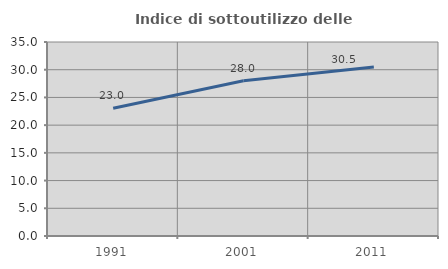
| Category | Indice di sottoutilizzo delle abitazioni  |
|---|---|
| 1991.0 | 23.049 |
| 2001.0 | 28.001 |
| 2011.0 | 30.509 |